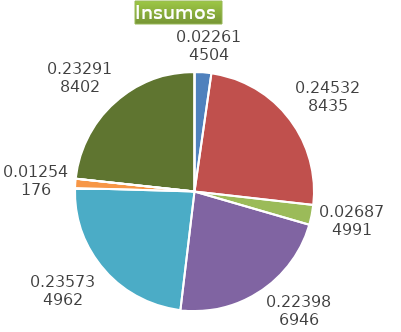
| Category | Series 0 |
|---|---|
| Control arvenses | 2262864 |
| Control fitosanitario | 24548179 |
| Cosecha y beneficio | 2689179.108 |
| Fertilización | 22412696 |
| Instalación | 23588232 |
| Otros | 1254960 |
| Podas | 0 |
| Riego | 0 |
| Transporte | 23306400 |
| Tutorado | 0 |